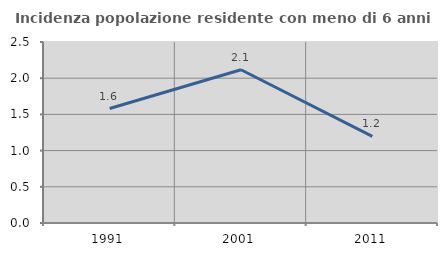
| Category | Incidenza popolazione residente con meno di 6 anni |
|---|---|
| 1991.0 | 1.581 |
| 2001.0 | 2.116 |
| 2011.0 | 1.198 |